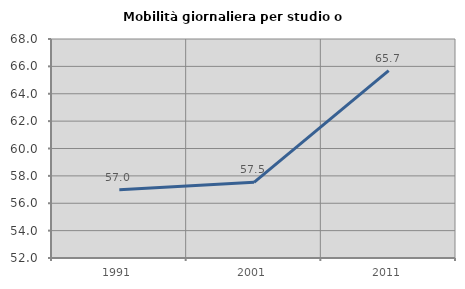
| Category | Mobilità giornaliera per studio o lavoro |
|---|---|
| 1991.0 | 56.989 |
| 2001.0 | 57.529 |
| 2011.0 | 65.693 |